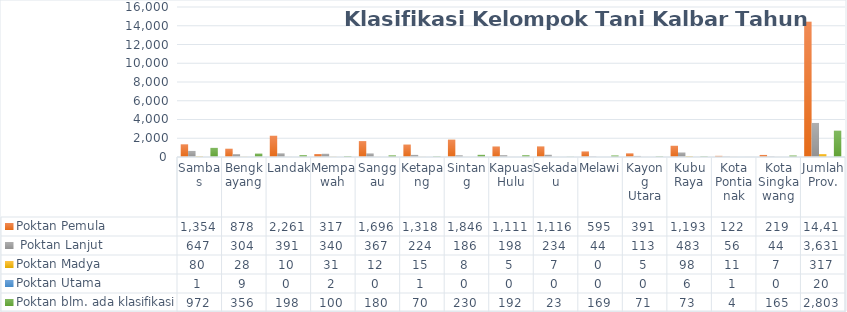
| Category | Poktan Pemula |  Poktan Lanjut | Poktan Madya | Poktan Utama | Poktan blm. ada klasifikasi |
|---|---|---|---|---|---|
| Sambas | 1354 | 647 | 80 | 1 | 972 |
| Bengkayang | 878 | 304 | 28 | 9 | 356 |
| Landak | 2261 | 391 | 10 | 0 | 198 |
| Mempawah | 317 | 340 | 31 | 2 | 100 |
| Sanggau | 1696 | 367 | 12 | 0 | 180 |
| Ketapang | 1318 | 224 | 15 | 1 | 70 |
| Sintang | 1846 | 186 | 8 | 0 | 230 |
| Kapuas Hulu | 1111 | 198 | 5 | 0 | 192 |
| Sekadau | 1116 | 234 | 7 | 0 | 23 |
| Melawi | 595 | 44 | 0 | 0 | 169 |
| Kayong Utara | 391 | 113 | 5 | 0 | 71 |
| Kubu Raya | 1193 | 483 | 98 | 6 | 73 |
| Kota Pontianak | 122 | 56 | 11 | 1 | 4 |
| Kota Singkawang | 219 | 44 | 7 | 0 | 165 |
| Jumlah Prov. | 14417 | 3631 | 317 | 20 | 2803 |